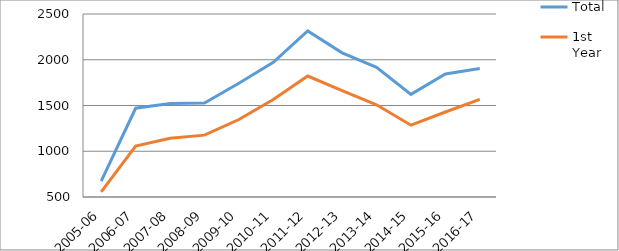
| Category | Total | 1st Year |
|---|---|---|
| 2005-06 | 674 | 556 |
| 2006-07 | 1470 | 1057 |
| 2007-08 | 1521 | 1141 |
| 2008-09 | 1526 | 1176 |
| 2009-10 | 1743 | 1347 |
| 2010-11 | 1971 | 1566 |
| 2011-12 | 2315 | 1822 |
| 2012-13 | 2075 | 1663 |
| 2013-14 | 1918 | 1508 |
| 2014-15 | 1622 | 1285 |
| 2015-16 | 1845 | 1429 |
| 2016-17 | 1905 | 1567 |